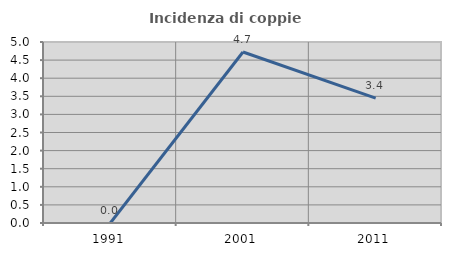
| Category | Incidenza di coppie miste |
|---|---|
| 1991.0 | 0 |
| 2001.0 | 4.724 |
| 2011.0 | 3.448 |